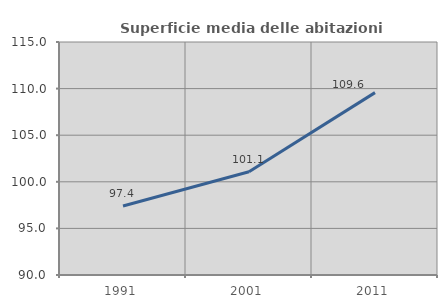
| Category | Superficie media delle abitazioni occupate |
|---|---|
| 1991.0 | 97.401 |
| 2001.0 | 101.076 |
| 2011.0 | 109.57 |